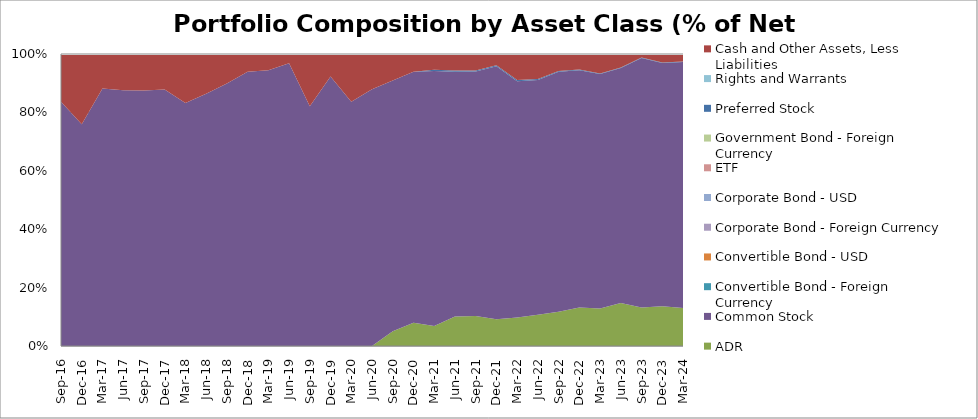
| Category | ADR | Common Stock | Convertible Bond - Foreign Currency  | Convertible Bond - USD | Corporate Bond - Foreign Currency  | Corporate Bond - USD | ETF | Government Bond - Foreign Currency  | Preferred Stock | Rights and Warrants | Cash and Other Assets, Less Liabilities |
|---|---|---|---|---|---|---|---|---|---|---|---|
| 2016-09-30 | 0 | 83.66 | 0 | 0 | 0 | 0 | 0 | 0 | 0 | 0 | 16.34 |
| 2016-12-31 | 0 | 75.91 | 0 | 0 | 0 | 0 | 0 | 0 | 0 | 0 | 24.09 |
| 2017-03-31 | 0 | 88.198 | 0 | 0 | 0 | 0 | 0 | 0 | 0 | 0 | 11.79 |
| 2017-06-30 | 0 | 87.565 | 0 | 0 | 0 | 0 | 0 | 0 | 0 | 0 | 12.434 |
| 2017-09-30 | 0 | 87.49 | 0 | 0 | 0 | 0 | 0 | 0 | 0 | 0 | 12.51 |
| 2017-12-31 | 0 | 87.87 | 0 | 0 | 0 | 0 | 0 | 0 | 0 | 0 | 12.13 |
| 2018-03-31 | 0 | 83.25 | 0 | 0 | 0 | 0 | 0 | 0 | 0 | 0 | 16.75 |
| 2018-06-30 | 0 | 86.4 | 0 | 0 | 0 | 0 | 0 | 0 | 0 | 0 | 13.6 |
| 2018-09-30 | 0 | 89.92 | 0 | 0 | 0 | 0 | 0 | 0 | 0 | 0 | 10.08 |
| 2018-12-31 | 0 | 93.96 | 0 | 0 | 0 | 0 | 0 | 0 | 0 | 0 | 6.04 |
| 2019-03-31 | 0 | 94.4 | 0 | 0 | 0 | 0 | 0 | 0 | 0 | 0 | 5.6 |
| 2019-06-30 | 0 | 96.82 | 0 | 0 | 0 | 0 | 0 | 0 | 0 | 0 | 3.18 |
| 2019-09-30 | 0 | 82.13 | 0 | 0 | 0 | 0 | 0 | 0 | 0 | 0 | 17.87 |
| 2019-12-31 | 0 | 92.32 | 0 | 0 | 0 | 0 | 0 | 0 | 0 | 0 | 7.68 |
| 2020-03-31 | 0 | 83.68 | 0 | 0 | 0 | 0 | 0 | 0 | 0 | 0 | 16.32 |
| 2020-06-30 | 0 | 87.91 | 0 | 0 | 0 | 0 | 0 | 0 | 0 | 0 | 12.09 |
| 2020-09-30 | 5.01 | 85.94 | 0 | 0 | 0 | 0 | 0 | 0 | 0 | 0 | 9.05 |
| 2020-12-31 | 7.97 | 85.99 | 0 | 0 | 0 | 0 | 0 | 0 | 0 | 0 | 6.04 |
| 2021-03-31 | 6.85 | 87.3 | 0 | 0 | 0 | 0 | 0 | 0 | 0.48 | 0 | 5.37 |
| 2021-06-30 | 10.09 | 83.83 | 0 | 0 | 0 | 0 | 0 | 0 | 0.41 | 0 | 5.67 |
| 2021-09-30 | 10.28 | 83.7 | 0 | 0 | 0 | 0 | 0 | 0 | 0.34 | 0 | 5.68 |
| 2021-12-31 | 9.13 | 86.66 | 0 | 0 | 0 | 0 | 0 | 0 | 0.34 | 0 | 3.87 |
| 2022-03-31 | 9.75 | 80.95 | 0 | 0 | 0 | 0 | 0 | 0 | 0.38 | 0 | 8.92 |
| 2022-06-30 | 10.74 | 80.35 | 0 | 0 | 0 | 0 | 0 | 0 | 0.35 | 0 | 8.56 |
| 2022-09-30 | 11.76 | 82.19 | 0 | 0 | 0 | 0 | 0 | 0 | 0.24 | 0 | 5.81 |
| 2022-12-31 | 13.2 | 81.22 | 0 | 0 | 0 | 0 | 0 | 0 | 0.23 | 0 | 5.35 |
| 2023-03-31 | 12.85 | 80.33 | 0 | 0 | 0 | 0 | 0 | 0 | 0.17 | 0 | 6.65 |
| 2023-06-30 | 14.73 | 80.47 | 0 | 0 | 0 | 0 | 0 | 0 | 0.15 | 0 | 4.65 |
| 2023-09-30 | 13.22 | 85.41 | 0 | 0 | 0 | 0 | 0 | 0 | 0.13 | 0 | 1.24 |
| 2023-12-31 | 13.63 | 83.31 | 0 | 0 | 0 | 0 | 0 | 0 | 0.14 | 0 | 2.92 |
| 2024-03-31 | 13.03 | 84.26 | 0 | 0 | 0 | 0 | 0 | 0 | 0.16 | 0 | 2.55 |